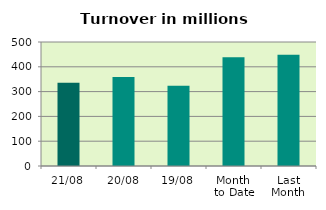
| Category | Series 0 |
|---|---|
| 21/08 | 335.609 |
| 20/08 | 358.37 |
| 19/08 | 323.71 |
| Month 
to Date | 438.907 |
| Last
Month | 448.907 |